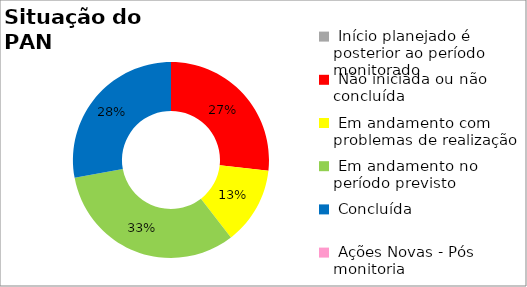
| Category | Series 0 |
|---|---|
|  Início planejado é posterior ao período monitorado | 0 |
|  Não iniciada ou não concluída | 0.267 |
|  Em andamento com problemas de realização | 0.128 |
|  Em andamento no período previsto  | 0.326 |
|  Concluída | 0.279 |
|  Ações Novas - Pós monitoria | 0 |